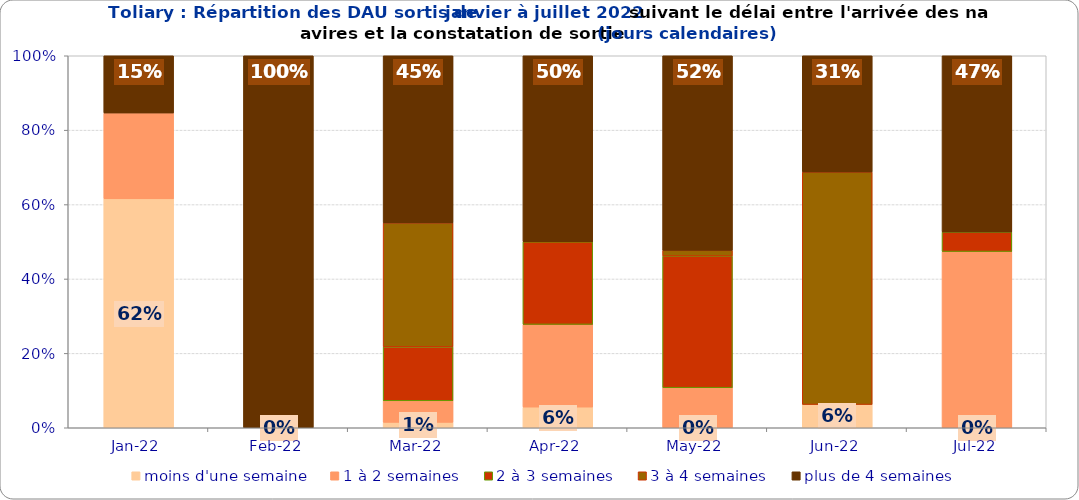
| Category | moins d'une semaine | 1 à 2 semaines | 2 à 3 semaines | 3 à 4 semaines | plus de 4 semaines |
|---|---|---|---|---|---|
| 2022-01-01 | 0.615 | 0.231 | 0 | 0 | 0.154 |
| 2022-02-01 | 0 | 0 | 0 | 0 | 1 |
| 2022-03-01 | 0.014 | 0.058 | 0.145 | 0.333 | 0.449 |
| 2022-04-01 | 0.056 | 0.222 | 0.222 | 0 | 0.5 |
| 2022-05-01 | 0 | 0.108 | 0.354 | 0.015 | 0.523 |
| 2022-06-01 | 0.062 | 0 | 0 | 0.625 | 0.312 |
| 2022-07-01 | 0 | 0.474 | 0.053 | 0 | 0.474 |